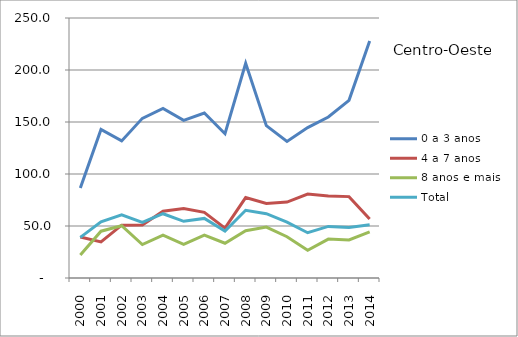
| Category | 0 a 3 anos | 4 a 7 anos | 8 anos e mais | Total |
|---|---|---|---|---|
| 2000.0 | 86.5 | 39.5 | 22.2 | 39.1 |
| 2001.0 | 142.9 | 34.7 | 45 | 54.1 |
| 2002.0 | 131.8 | 50.8 | 50.3 | 60.7 |
| 2003.0 | 153.5 | 51 | 32.2 | 53.5 |
| 2004.0 | 163 | 64.2 | 41.3 | 61.8 |
| 2005.0 | 151.6 | 66.9 | 32.3 | 54.5 |
| 2006.0 | 158.6 | 63.1 | 41.3 | 57.3 |
| 2007.0 | 138.7 | 47.9 | 33.4 | 45.1 |
| 2008.0 | 206.5 | 77.3 | 45.4 | 65.1 |
| 2009.0 | 146.5 | 71.6 | 48.9 | 61.8 |
| 2010.0 | 131.306 | 72.976 | 39.655 | 53.707 |
| 2011.0 | 144.598 | 80.775 | 26.674 | 43.514 |
| 2012.0 | 154.839 | 78.889 | 37.425 | 49.602 |
| 2013.0 | 170.819 | 78.253 | 36.596 | 48.522 |
| 2014.0 | 227.79 | 56.75 | 44.399 | 51.211 |